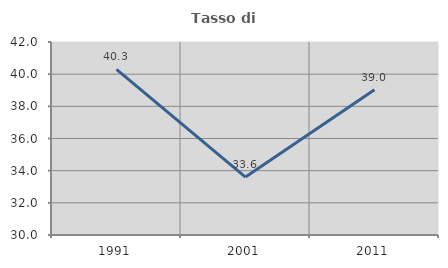
| Category | Tasso di occupazione   |
|---|---|
| 1991.0 | 40.296 |
| 2001.0 | 33.6 |
| 2011.0 | 39.034 |